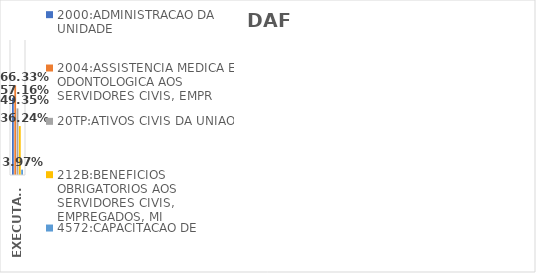
| Category | 2000:ADMINISTRACAO DA UNIDADE | 2004:ASSISTENCIA MEDICA E ODONTOLOGICA AOS SERVIDORES CIVIS, EMPR | 20TP:ATIVOS CIVIS DA UNIAO | 212B:BENEFICIOS OBRIGATORIOS AOS SERVIDORES CIVIS, EMPREGADOS, MI | 4572:CAPACITACAO DE SERVIDORES PUBLICOS FEDERAIS EM PROCESSO DE Q |
|---|---|---|---|---|---|
| EXECUTADO | 0.572 | 0.663 | 0.494 | 0.362 | 0.04 |